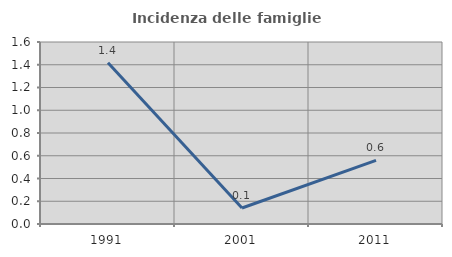
| Category | Incidenza delle famiglie numerose |
|---|---|
| 1991.0 | 1.418 |
| 2001.0 | 0.14 |
| 2011.0 | 0.559 |